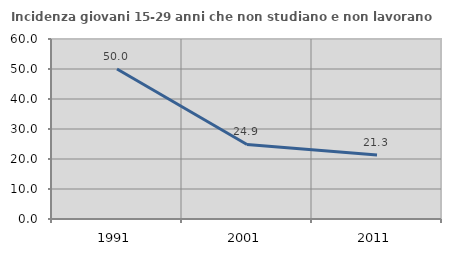
| Category | Incidenza giovani 15-29 anni che non studiano e non lavorano  |
|---|---|
| 1991.0 | 50 |
| 2001.0 | 24.855 |
| 2011.0 | 21.306 |